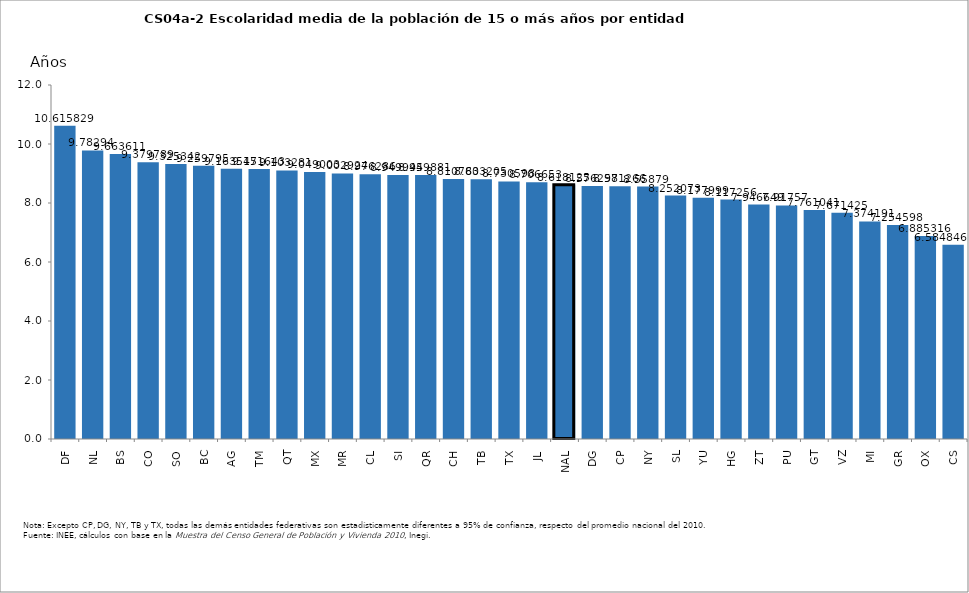
| Category | 2010 |
|---|---|
| DF | 10.616 |
| NL | 9.783 |
| BS | 9.664 |
| CO | 9.38 |
| SO | 9.325 |
| BC | 9.26 |
| AG | 9.164 |
| TM | 9.152 |
| QT | 9.103 |
| MX | 9.049 |
| MR | 9.003 |
| CL | 8.976 |
| SI | 8.95 |
| QR | 8.95 |
| CH | 8.811 |
| TB | 8.803 |
| TX | 8.731 |
| JL | 8.707 |
| NAL | 8.618 |
| DG | 8.576 |
| CP | 8.571 |
| NY | 8.559 |
| SL | 8.252 |
| YU | 8.178 |
| HG | 8.117 |
| ZT | 7.947 |
| PU | 7.918 |
| GT | 7.761 |
| VZ | 7.671 |
| MI | 7.374 |
| GR | 7.255 |
| OX | 6.885 |
| CS | 6.585 |